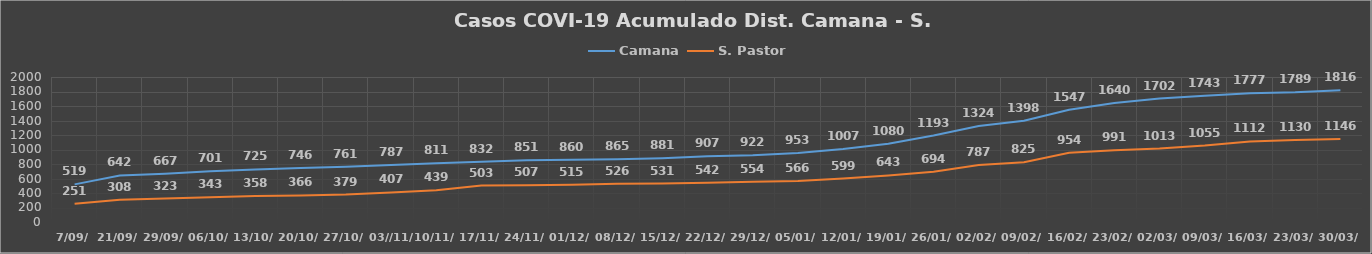
| Category | Camana | S. Pastor |
|---|---|---|
| 7/09/ | 519 | 251 |
| 21/09/ | 642 | 308 |
| 29/09/ | 667 | 323 |
| 06/10/ | 701 | 343 |
| 13/10/ | 725 | 358 |
| 20/10/ | 746 | 366 |
| 27/10/ | 761 | 379 |
| 03//11/ | 787 | 407 |
| 10/11/ | 811 | 439 |
| 17/11/ | 832 | 503 |
| 24/11/ | 851 | 507 |
| 01/12/ | 860 | 515 |
| 08/12/ | 865 | 526 |
| 15/12/ | 881 | 531 |
| 22/12/ | 907 | 542 |
| 29/12/ | 922 | 554 |
| 05/01/ | 953 | 566 |
| 12/01/ | 1007 | 599 |
| 19/01/ | 1080 | 643 |
| 26/01/ | 1193 | 694 |
| 02/02/ | 1324 | 787 |
| 09/02/ | 1398 | 825 |
| 16/02/ | 1547 | 954 |
| 23/02/ | 1640 | 991 |
| 02/03/ | 1702 | 1013 |
| 09/03/ | 1743 | 1055 |
| 16/03/ | 1777 | 1112 |
| 23/03/ | 1789 | 1130 |
| 30/03/ | 1816 | 1146 |